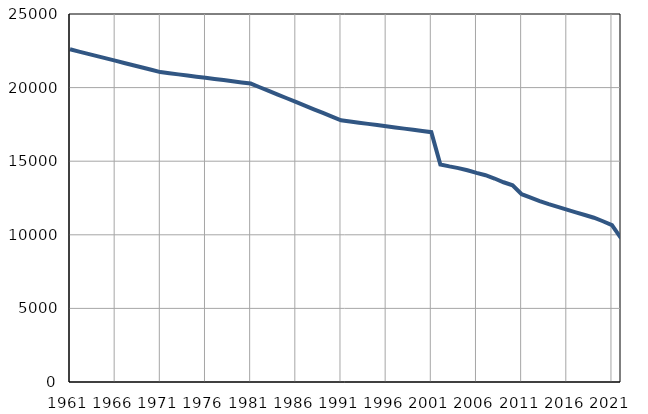
| Category | Population
size |
|---|---|
| 1961.0 | 22602 |
| 1962.0 | 22447 |
| 1963.0 | 22292 |
| 1964.0 | 22138 |
| 1965.0 | 21983 |
| 1966.0 | 21829 |
| 1967.0 | 21674 |
| 1968.0 | 21519 |
| 1969.0 | 21364 |
| 1970.0 | 21210 |
| 1971.0 | 21055 |
| 1972.0 | 20977 |
| 1973.0 | 20899 |
| 1974.0 | 20821 |
| 1975.0 | 20743 |
| 1976.0 | 20665 |
| 1977.0 | 20587 |
| 1978.0 | 20509 |
| 1979.0 | 20431 |
| 1980.0 | 20353 |
| 1981.0 | 20275 |
| 1982.0 | 20025 |
| 1983.0 | 19775 |
| 1984.0 | 19526 |
| 1985.0 | 19276 |
| 1986.0 | 19026 |
| 1987.0 | 18776 |
| 1988.0 | 18526 |
| 1989.0 | 18277 |
| 1990.0 | 18027 |
| 1991.0 | 17777 |
| 1992.0 | 17697 |
| 1993.0 | 17616 |
| 1994.0 | 17536 |
| 1995.0 | 17455 |
| 1996.0 | 17375 |
| 1997.0 | 17294 |
| 1998.0 | 17214 |
| 1999.0 | 17133 |
| 2000.0 | 17053 |
| 2001.0 | 16972 |
| 2002.0 | 14780 |
| 2003.0 | 14648 |
| 2004.0 | 14532 |
| 2005.0 | 14382 |
| 2006.0 | 14205 |
| 2007.0 | 14047 |
| 2008.0 | 13825 |
| 2009.0 | 13569 |
| 2010.0 | 13359 |
| 2011.0 | 12756 |
| 2012.0 | 12525 |
| 2013.0 | 12292 |
| 2014.0 | 12084 |
| 2015.0 | 11899 |
| 2016.0 | 11708 |
| 2017.0 | 11528 |
| 2018.0 | 11348 |
| 2019.0 | 11159 |
| 2020.0 | 10920 |
| 2021.0 | 10653 |
| 2022.0 | 9771 |